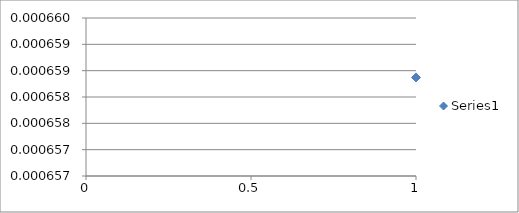
| Category | Series 0 |
|---|---|
| 0 | 0.001 |
| 1 | 0.001 |
| 2 | 0.001 |
| 3 | 0.001 |
| 4 | 0.001 |
| 5 | 0.001 |
| 6 | 0.001 |
| 7 | 0.001 |
| 8 | 0.001 |
| 9 | 0.001 |
| 10 | 0.001 |
| 11 | 0.001 |
| 12 | 0.001 |
| 13 | 0.001 |
| 14 | 0.001 |
| 15 | 0.001 |
| 16 | 0.001 |
| 17 | 0.001 |
| 18 | 0.001 |
| 19 | 0.001 |
| 20 | 0.001 |
| 21 | 0.001 |
| 22 | 0.001 |
| 23 | 0.001 |
| 24 | 0.001 |
| 25 | 0.001 |
| 26 | 0.001 |
| 27 | 0.001 |
| 28 | 0.001 |
| 29 | 0.001 |
| 30 | 0.001 |
| 31 | 0.001 |
| 32 | 0.001 |
| 33 | 0.001 |
| 34 | 0.001 |
| 35 | 0.001 |
| 36 | 0.001 |
| 37 | 0.001 |
| 38 | 0.001 |
| 39 | 0.001 |
| 40 | 0.001 |
| 41 | 0.001 |
| 42 | 0.001 |
| 43 | 0.001 |
| 44 | 0.001 |
| 45 | 0.001 |
| 46 | 0.001 |
| 47 | 0.001 |
| 48 | 0.001 |
| 49 | 0.001 |
| 50 | 0.001 |
| 51 | 0.001 |
| 52 | 0.001 |
| 53 | 0.001 |
| 54 | 0.001 |
| 55 | 0.001 |
| 56 | 0.001 |
| 57 | 0.001 |
| 58 | 0.001 |
| 59 | 0.001 |
| 60 | 0.001 |
| 61 | 0.001 |
| 62 | 0.001 |
| 63 | 0.001 |
| 64 | 0.001 |
| 65 | 0.001 |
| 66 | 0.001 |
| 67 | 0.001 |
| 68 | 0.001 |
| 69 | 0.001 |
| 70 | 0.001 |
| 71 | 0.001 |
| 72 | 0.001 |
| 73 | 0.001 |
| 74 | 0.001 |
| 75 | 0.001 |
| 76 | 0.001 |
| 77 | 0.001 |
| 78 | 0.001 |
| 79 | 0.001 |
| 80 | 0.001 |
| 81 | 0.001 |
| 82 | 0.001 |
| 83 | 0.001 |
| 84 | 0.001 |